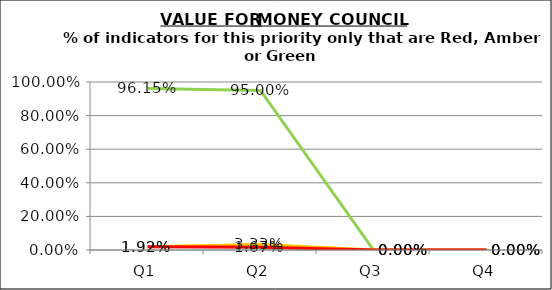
| Category | Green | Amber | Red |
|---|---|---|---|
| Q1 | 0.962 | 0.019 | 0.019 |
| Q2 | 0.95 | 0.033 | 0.017 |
| Q3 | 0 | 0 | 0 |
| Q4 | 0 | 0 | 0 |